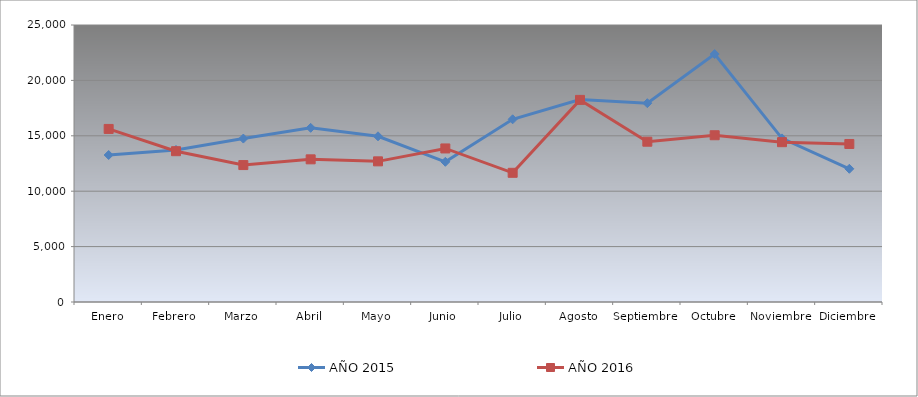
| Category | AÑO 2015 | AÑO 2016 |
|---|---|---|
| Enero | 13266.867 | 15619.963 |
| Febrero | 13720.628 | 13611.187 |
| Marzo | 14750.439 | 12358.064 |
| Abril | 15719.105 | 12876.001 |
| Mayo | 14954.792 | 12694.172 |
| Junio | 12652.198 | 13858.349 |
| Julio | 16489.855 | 11660.66 |
| Agosto | 18277.543 | 18241.132 |
| Septiembre | 17944.463 | 14466.019 |
| Octubre | 22377.48 | 15050.863 |
| Noviembre | 14764.921 | 14423.514 |
| Diciembre | 12023.048 | 14261.363 |